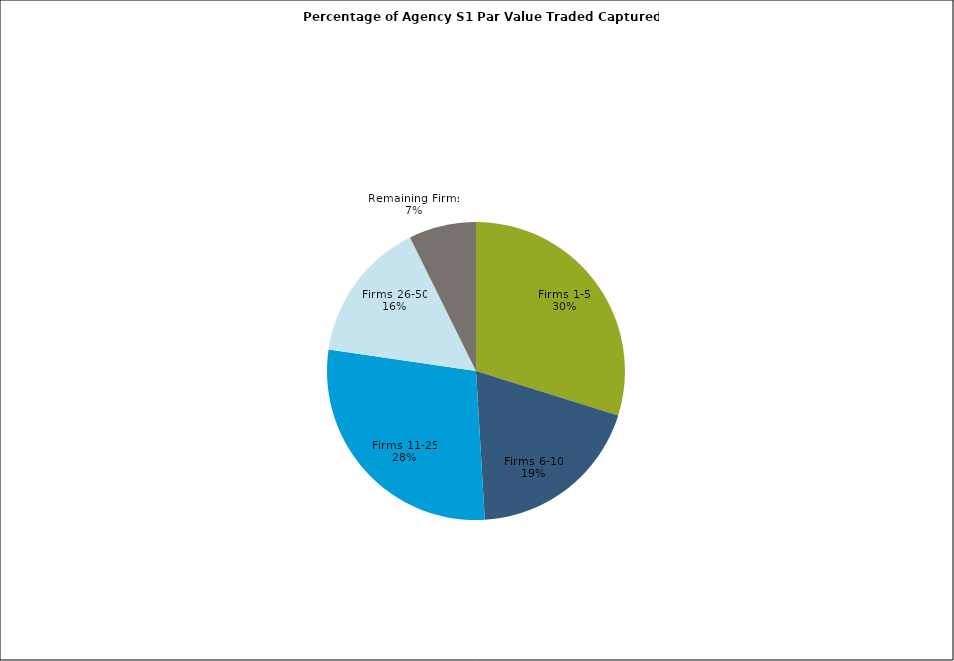
| Category | Series 0 |
|---|---|
| Firms 1-5 | 0.298 |
| Firms 6-10 | 0.192 |
| Firms 11-25 | 0.282 |
| Firms 26-50 | 0.154 |
| Remaining Firms | 0.073 |